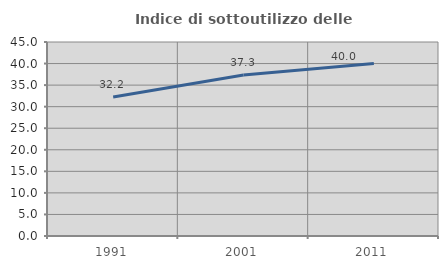
| Category | Indice di sottoutilizzo delle abitazioni  |
|---|---|
| 1991.0 | 32.239 |
| 2001.0 | 37.346 |
| 2011.0 | 40 |